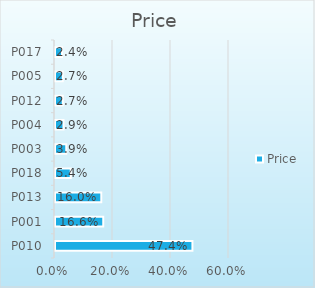
| Category | Price |
|---|---|
| P010 | 0.474 |
| P001 | 0.166 |
| P013 | 0.16 |
| P018 | 0.054 |
| P003 | 0.039 |
| P004 | 0.029 |
| P012 | 0.027 |
| P005 | 0.027 |
| P017 | 0.024 |